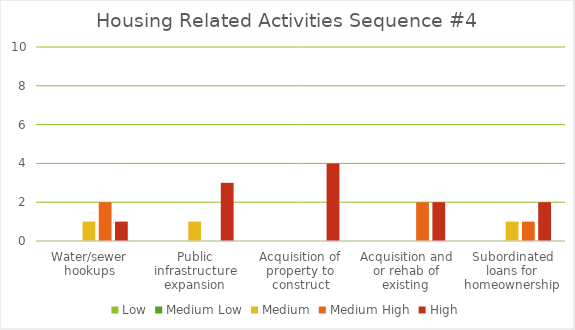
| Category | Low | Medium Low | Medium | Medium High | High |
|---|---|---|---|---|---|
| Water/sewer hookups | 0 | 0 | 1 | 2 | 1 |
| Public infrastructure expansion | 0 | 0 | 1 | 0 | 3 |
| Acquisition of property to construct | 0 | 0 | 0 | 0 | 4 |
| Acquisition and or rehab of existing | 0 | 0 | 0 | 2 | 2 |
| Subordinated loans for homeownership | 0 | 0 | 1 | 1 | 2 |